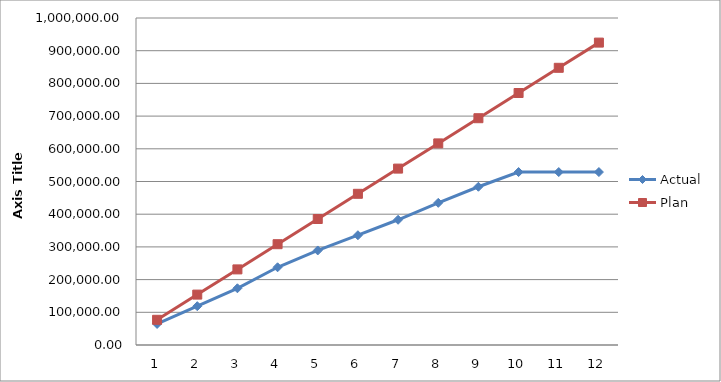
| Category | Actual | Plan |
|---|---|---|
| 0 | 64373.22 | 77062.5 |
| 1 | 118688.93 | 154125 |
| 2 | 173425.67 | 231187.5 |
| 3 | 237660.79 | 308250 |
| 4 | 289095.32 | 385312.5 |
| 5 | 335714.28 | 462375 |
| 6 | 382979.34 | 539437.5 |
| 7 | 434728.76 | 616500 |
| 8 | 483907.62 | 693562.5 |
| 9 | 528871.57 | 770625 |
| 10 | 528871.57 | 847687.5 |
| 11 | 528871.57 | 924750 |